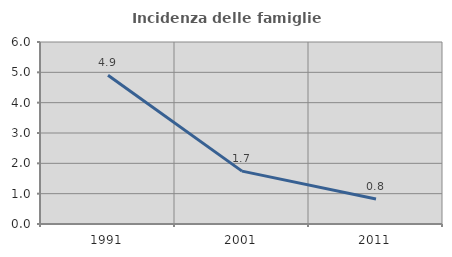
| Category | Incidenza delle famiglie numerose |
|---|---|
| 1991.0 | 4.903 |
| 2001.0 | 1.744 |
| 2011.0 | 0.823 |